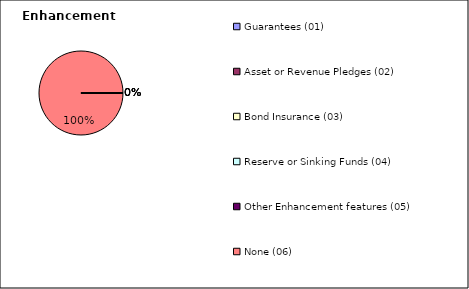
| Category | Enhancement Feature |
|---|---|
| Guarantees (01) | 0 |
| Asset or Revenue Pledges (02) | 0 |
| Bond Insurance (03) | 0 |
| Reserve or Sinking Funds (04) | 0 |
| Other Enhancement features (05) | 0 |
| None (06) | 6316405.74 |